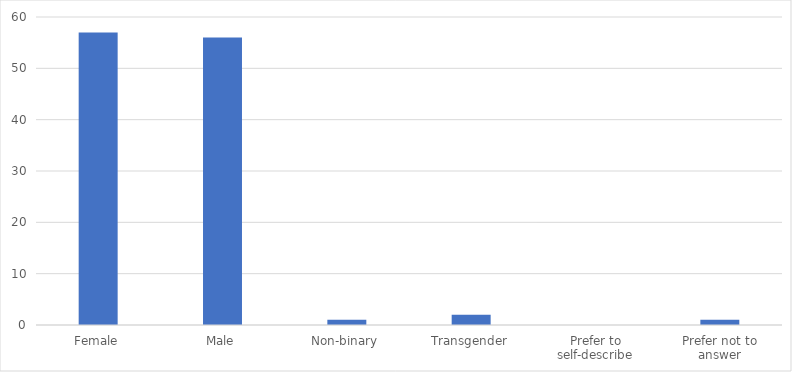
| Category | Number of Responses |
|---|---|
| Female | 57 |
| Male | 56 |
| Non-binary | 1 |
| Transgender | 2 |
| Prefer to self-describe | 0 |
| Prefer not to answer | 1 |